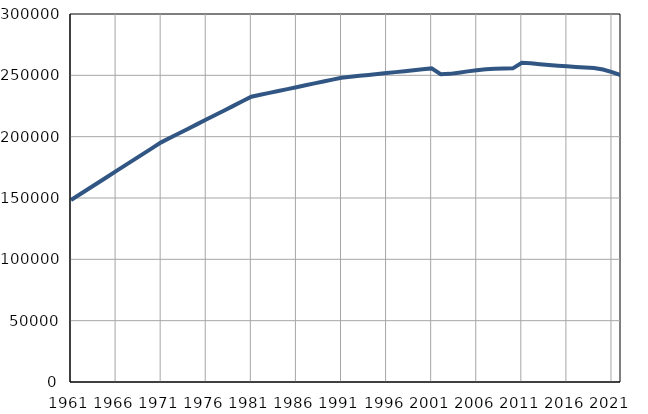
| Category | Population
size |
|---|---|
| 1961.0 | 148354 |
| 1962.0 | 153055 |
| 1963.0 | 157755 |
| 1964.0 | 162457 |
| 1965.0 | 167157 |
| 1966.0 | 171858 |
| 1967.0 | 176559 |
| 1968.0 | 181259 |
| 1969.0 | 185961 |
| 1970.0 | 190661 |
| 1971.0 | 195362 |
| 1972.0 | 199082 |
| 1973.0 | 202802 |
| 1974.0 | 206522 |
| 1975.0 | 210243 |
| 1976.0 | 213962 |
| 1977.0 | 217682 |
| 1978.0 | 221403 |
| 1979.0 | 225123 |
| 1980.0 | 228843 |
| 1981.0 | 232563 |
| 1982.0 | 234116 |
| 1983.0 | 235668 |
| 1984.0 | 237220 |
| 1985.0 | 238772 |
| 1986.0 | 240325 |
| 1987.0 | 241877 |
| 1988.0 | 243430 |
| 1989.0 | 244981 |
| 1990.0 | 246534 |
| 1991.0 | 248086 |
| 1992.0 | 248842 |
| 1993.0 | 249598 |
| 1994.0 | 250354 |
| 1995.0 | 251110 |
| 1996.0 | 251866 |
| 1997.0 | 252622 |
| 1998.0 | 253378 |
| 1999.0 | 254134 |
| 2000.0 | 254889 |
| 2001.0 | 255646 |
| 2002.0 | 250847 |
| 2003.0 | 251198 |
| 2004.0 | 252131 |
| 2005.0 | 253214 |
| 2006.0 | 254164 |
| 2007.0 | 254970 |
| 2008.0 | 255295 |
| 2009.0 | 255479 |
| 2010.0 | 255699 |
| 2011.0 | 260307 |
| 2012.0 | 259790 |
| 2013.0 | 259125 |
| 2014.0 | 258500 |
| 2015.0 | 257883 |
| 2016.0 | 257348 |
| 2017.0 | 256825 |
| 2018.0 | 256381 |
| 2019.0 | 255901 |
| 2020.0 | 254723 |
| 2021.0 | 252655 |
| 2022.0 | 250091 |